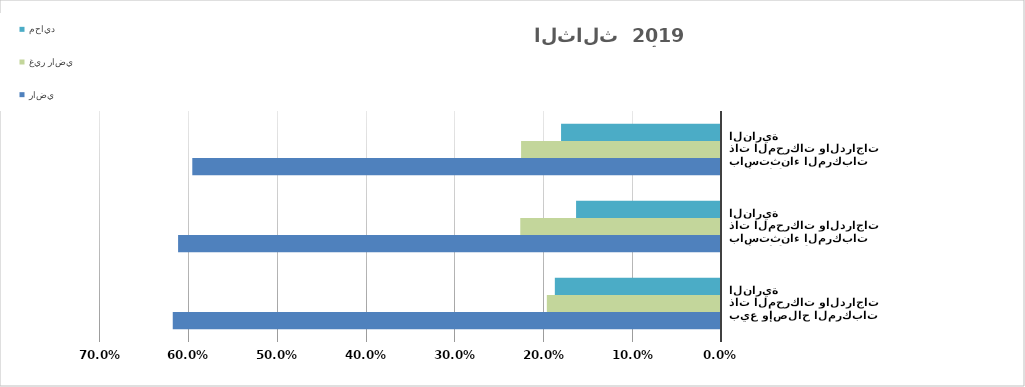
| Category | راضي  | غير راضي | محايد |
|---|---|---|---|
| بيع وإصلاح المركبات ذات المحركات والدراجات النارية | 0.617 | 0.196 | 0.187 |
| تجارة الجملة، باستثناء المركبات ذات المحركات والدراجات النارية | 0.611 | 0.226 | 0.163 |
| تجارة التجزئة، باستثناء المركبات ذات المحركات والدراجات النارية | 0.595 | 0.225 | 0.18 |